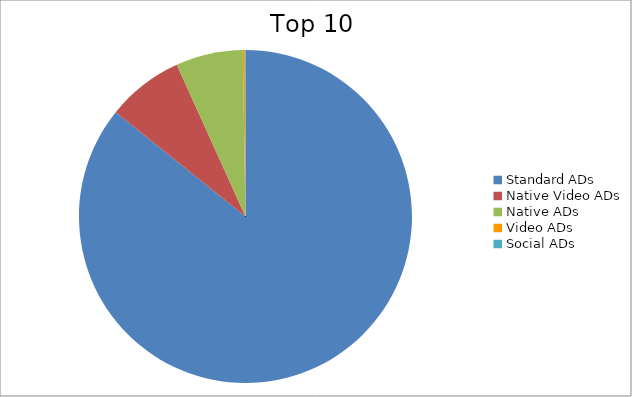
| Category | Series 0 |
|---|---|
| Standard ADs | 85.77 |
| Native Video ADs | 7.45 |
| Native ADs | 6.51 |
| Video ADs | 0.19 |
| Social ADs | 0.07 |